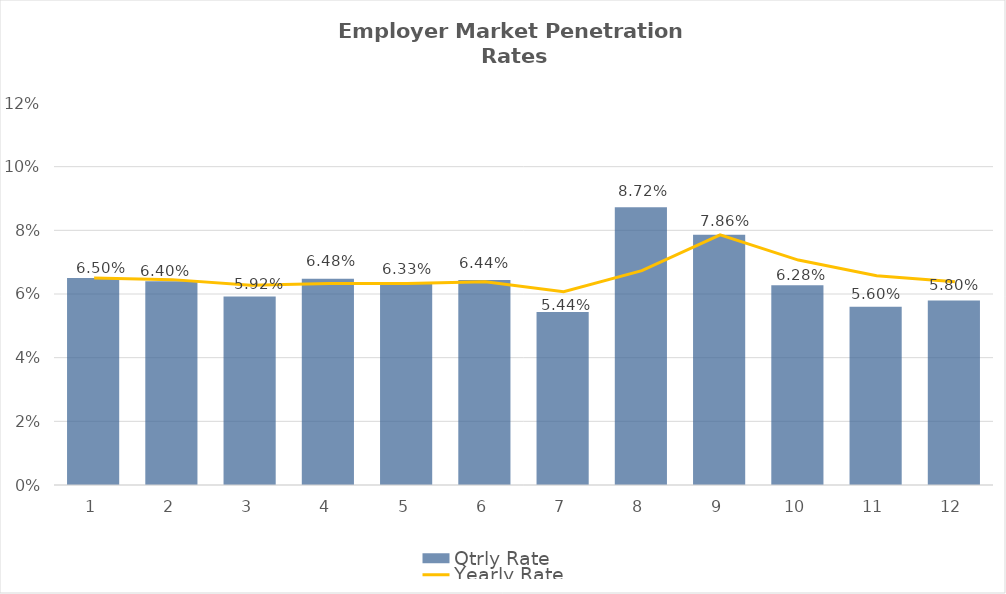
| Category | Qtrly Rate |
|---|---|
| 0 | 0.065 |
| 1 | 0.064 |
| 2 | 0.059 |
| 3 | 0.065 |
| 4 | 0.063 |
| 5 | 0.064 |
| 6 | 0.054 |
| 7 | 0.087 |
| 8 | 0.079 |
| 9 | 0.063 |
| 10 | 0.056 |
| 11 | 0.058 |